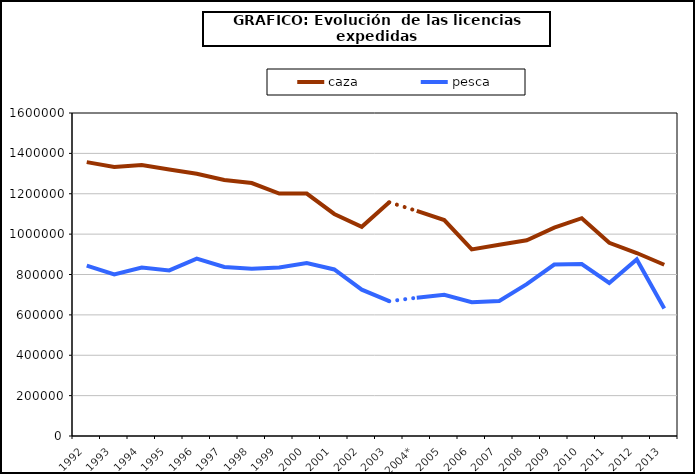
| Category | caza | pesca |
|---|---|---|
| 1992 | 1356553 | 844299 |
| 1993 | 1332252 | 799990 |
| 1994 | 1342603 | 834085 |
| 1995 | 1320315 | 820252 |
| 1996 | 1298860 | 878282 |
| 1997 | 1268057 | 837092 |
| 1998 | 1253105 | 829083 |
| 1999 | 1200951 | 834680 |
| 2000 | 1200875 | 856450 |
| 2001 | 1099856 | 825020 |
| 2002 | 1036340 | 724800 |
| 2003 | 1157969 | 667655 |
| 2004* | 1115000 | 685000 |
| 2005 | 1069804 | 699078 |
| 2006 | 924524 | 663000 |
| 2007 | 946965 | 668685 |
| 2008 | 969298 | 751937 |
| 2009 | 1032242 | 849102 |
| 2010 | 1078852 | 851759 |
| 2011 | 957191 | 758018 |
| 2012 | 906437 | 874802 |
| 2013 | 848243 | 631643 |